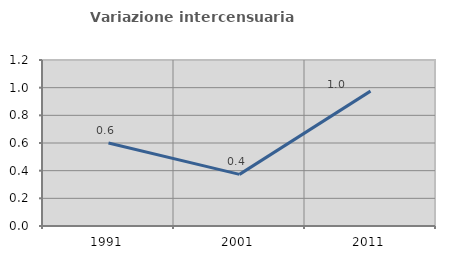
| Category | Variazione intercensuaria annua |
|---|---|
| 1991.0 | 0.6 |
| 2001.0 | 0.373 |
| 2011.0 | 0.975 |